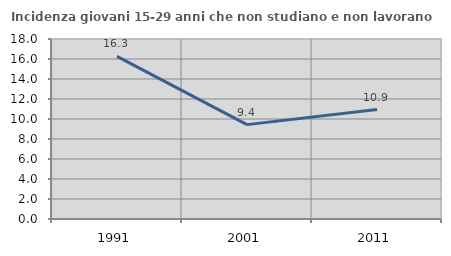
| Category | Incidenza giovani 15-29 anni che non studiano e non lavorano  |
|---|---|
| 1991.0 | 16.261 |
| 2001.0 | 9.437 |
| 2011.0 | 10.947 |